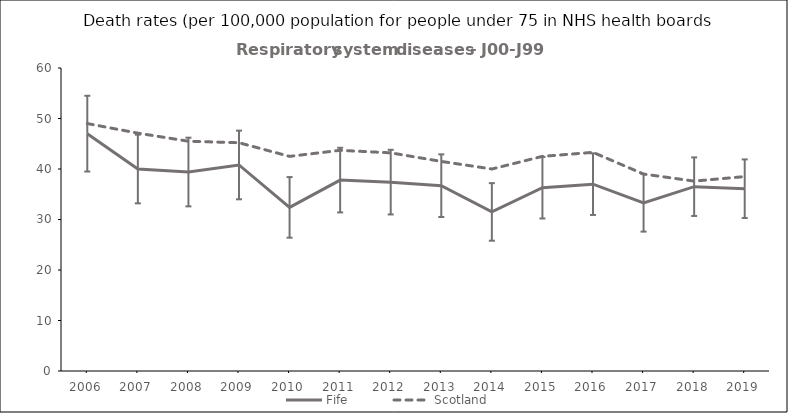
| Category | Fife | Scotland |
|---|---|---|
| 2006.0 | 47 | 49 |
| 2007.0 | 40 | 47.1 |
| 2008.0 | 39.4 | 45.5 |
| 2009.0 | 40.8 | 45.2 |
| 2010.0 | 32.4 | 42.5 |
| 2011.0 | 37.8 | 43.7 |
| 2012.0 | 37.4 | 43.2 |
| 2013.0 | 36.7 | 41.5 |
| 2014.0 | 31.5 | 40 |
| 2015.0 | 36.3 | 42.5 |
| 2016.0 | 37 | 43.3 |
| 2017.0 | 33.3 | 39 |
| 2018.0 | 36.5 | 37.6 |
| 2019.0 | 36.1 | 38.5 |